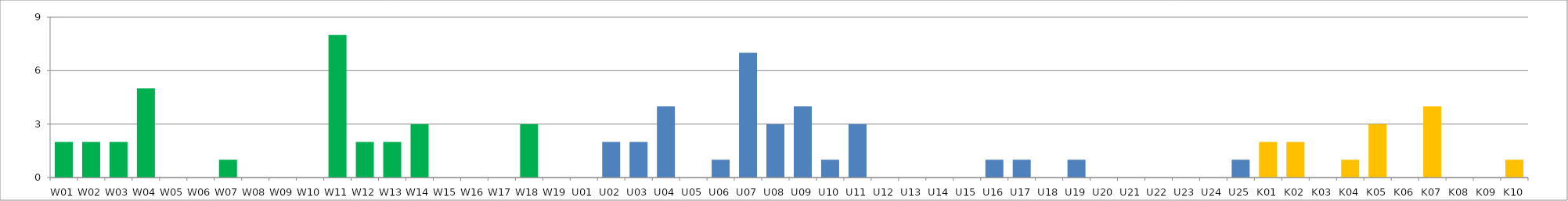
| Category | Series 0 |
|---|---|
| W01 | 2 |
| W02 | 2 |
| W03 | 2 |
| W04 | 5 |
| W05 | 0 |
| W06 | 0 |
| W07 | 1 |
| W08 | 0 |
| W09 | 0 |
| W10 | 0 |
| W11 | 8 |
| W12 | 2 |
| W13 | 2 |
| W14 | 3 |
| W15 | 0 |
| W16 | 0 |
| W17 | 0 |
| W18 | 3 |
| W19 | 0 |
| U01 | 0 |
| U02 | 2 |
| U03 | 2 |
| U04 | 4 |
| U05 | 0 |
| U06 | 1 |
| U07 | 7 |
| U08 | 3 |
| U09 | 4 |
| U10 | 1 |
| U11 | 3 |
| U12 | 0 |
| U13 | 0 |
| U14 | 0 |
| U15 | 0 |
| U16 | 1 |
| U17 | 1 |
| U18 | 0 |
| U19 | 1 |
| U20 | 0 |
| U21 | 0 |
| U22 | 0 |
| U23 | 0 |
| U24 | 0 |
| U25 | 1 |
| K01 | 2 |
| K02 | 2 |
| K03 | 0 |
| K04 | 1 |
| K05 | 3 |
| K06 | 0 |
| K07 | 4 |
| K08 | 0 |
| K09 | 0 |
| K10 | 1 |